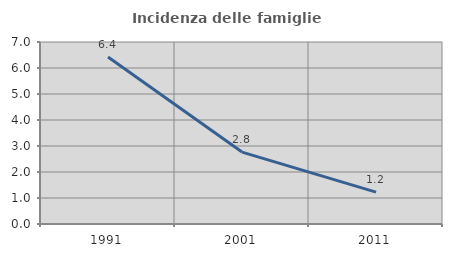
| Category | Incidenza delle famiglie numerose |
|---|---|
| 1991.0 | 6.421 |
| 2001.0 | 2.766 |
| 2011.0 | 1.226 |